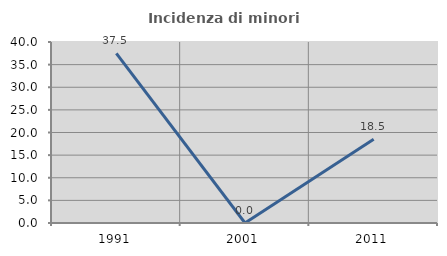
| Category | Incidenza di minori stranieri |
|---|---|
| 1991.0 | 37.5 |
| 2001.0 | 0 |
| 2011.0 | 18.519 |